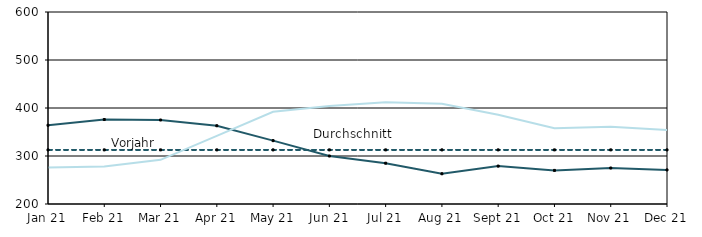
| Category | Berichtsjahr | Durchschnitt | Vorjahr |
|---|---|---|---|
| 2021-01-01 | 364 | 312.75 | 276 |
| 2021-02-01 | 376 | 312.75 | 278 |
| 2021-03-01 | 375 | 312.75 | 292 |
| 2021-04-01 | 363 | 312.75 | 342 |
| 2021-05-01 | 332 | 312.75 | 392 |
| 2021-06-01 | 300 | 312.75 | 404 |
| 2021-07-01 | 285 | 312.75 | 412 |
| 2021-08-01 | 263 | 312.75 | 409 |
| 2021-09-01 | 279 | 312.75 | 386 |
| 2021-10-01 | 270 | 312.75 | 358 |
| 2021-11-01 | 275 | 312.75 | 361 |
| 2021-12-01 | 271 | 312.75 | 354 |